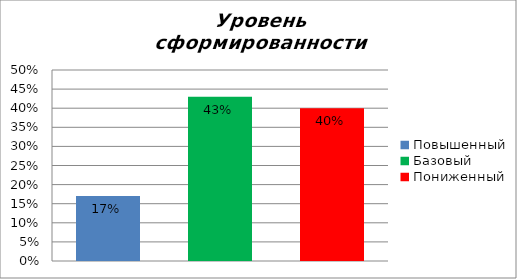
| Category | Уровень сформированности предметных результатов |
|---|---|
| Повышенный | 0.17 |
| Базовый | 0.43 |
| Пониженный | 0.4 |